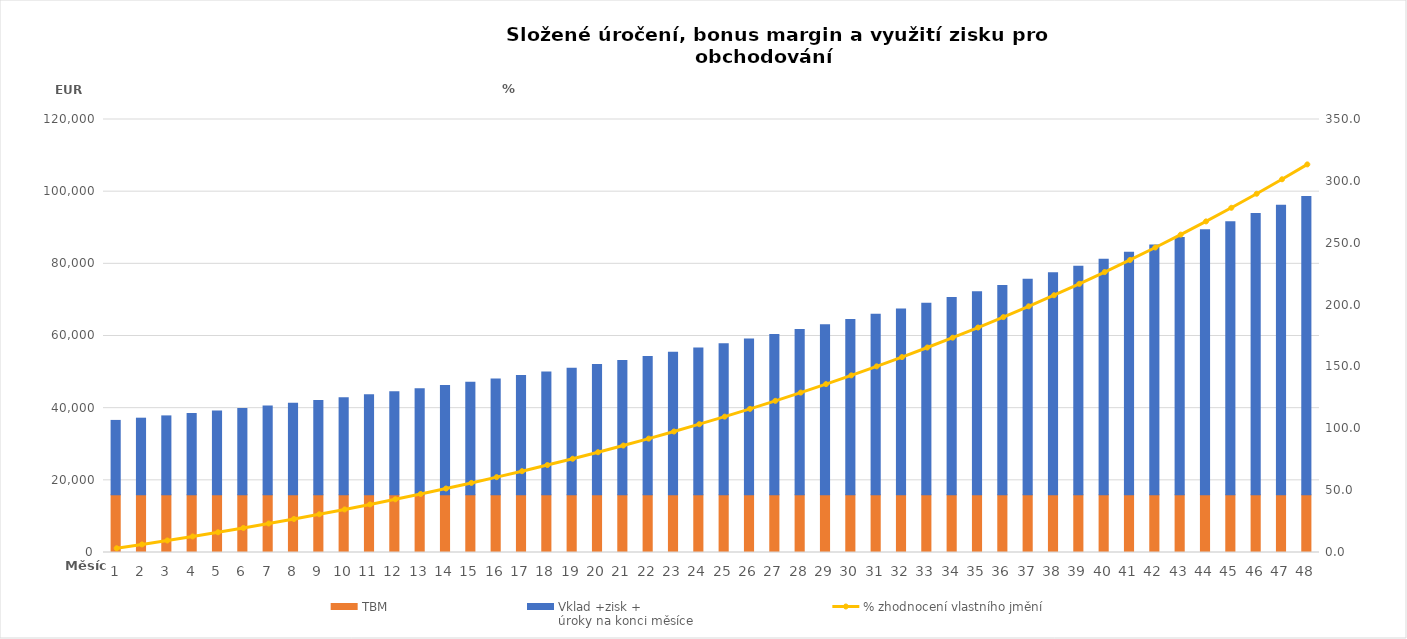
| Category | TBM | Vklad +zisk +
úroky na konci měsíce |
|---|---|---|
| 1.0 | 16000 | 20604 |
| 2.0 | 16000 | 21222.12 |
| 3.0 | 16000 | 21858.784 |
| 4.0 | 16000 | 22514.547 |
| 5.0 | 16000 | 23189.984 |
| 6.0 | 16000 | 23885.683 |
| 7.0 | 16000 | 24602.254 |
| 8.0 | 16000 | 25340.321 |
| 9.0 | 16000 | 26100.531 |
| 10.0 | 16000 | 26883.547 |
| 11.0 | 16000 | 27690.053 |
| 12.0 | 16000 | 28520.755 |
| 13.0 | 16000 | 29376.377 |
| 14.0 | 16000 | 30257.669 |
| 15.0 | 16000 | 31165.399 |
| 16.0 | 16000 | 32100.361 |
| 17.0 | 16000 | 33063.371 |
| 18.0 | 16000 | 34055.273 |
| 19.0 | 16000 | 35076.931 |
| 20.0 | 16000 | 36129.239 |
| 21.0 | 16000 | 37213.116 |
| 22.0 | 16000 | 38329.509 |
| 23.0 | 16000 | 39479.395 |
| 24.0 | 16000 | 40663.776 |
| 25.0 | 16000 | 41883.69 |
| 26.0 | 16000 | 43140.2 |
| 27.0 | 16000 | 44434.406 |
| 28.0 | 16000 | 45767.439 |
| 29.0 | 16000 | 47140.462 |
| 30.0 | 16000 | 48554.676 |
| 31.0 | 16000 | 50011.316 |
| 32.0 | 16000 | 51511.655 |
| 33.0 | 16000 | 53057.005 |
| 34.0 | 16000 | 54648.715 |
| 35.0 | 16000 | 56288.177 |
| 36.0 | 16000 | 57976.822 |
| 37.0 | 16000 | 59716.127 |
| 38.0 | 16000 | 61507.61 |
| 39.0 | 16000 | 63352.839 |
| 40.0 | 16000 | 65253.424 |
| 41.0 | 16000 | 67211.027 |
| 42.0 | 16000 | 69227.357 |
| 43.0 | 16000 | 71304.178 |
| 44.0 | 16000 | 73443.304 |
| 45.0 | 16000 | 75646.603 |
| 46.0 | 16000 | 77916.001 |
| 47.0 | 16000 | 80253.481 |
| 48.0 | 16000 | 82661.085 |